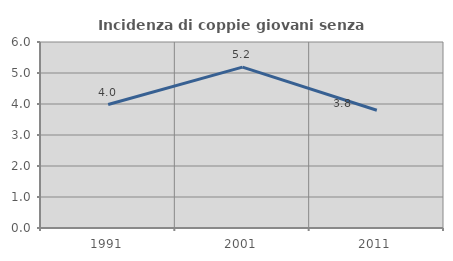
| Category | Incidenza di coppie giovani senza figli |
|---|---|
| 1991.0 | 3.982 |
| 2001.0 | 5.19 |
| 2011.0 | 3.797 |